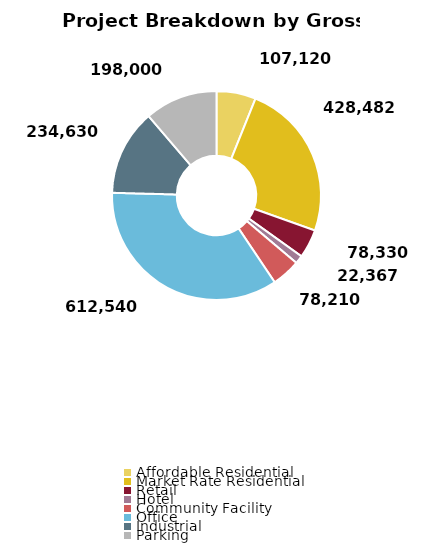
| Category | Series 0 |
|---|---|
| Affordable Residential | 107120.455 |
| Market Rate Residential | 428481.82 |
| Retail | 78330 |
| Hotel | 22366.613 |
| Community Facility | 78210 |
| Office | 612540.111 |
| Industrial | 234630 |
| Parking | 198000 |